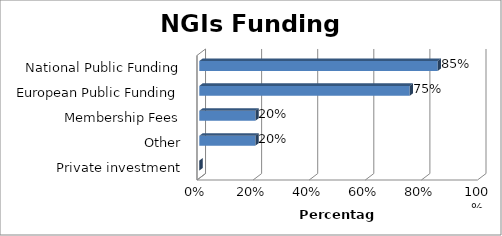
| Category | Series 0 |
|---|---|
| Private investment | 0 |
| Other | 0.2 |
| Membership Fees | 0.2 |
| European Public Funding | 0.75 |
| National Public Funding | 0.85 |